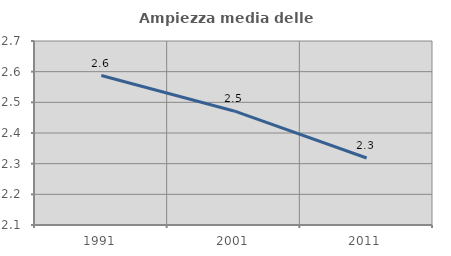
| Category | Ampiezza media delle famiglie |
|---|---|
| 1991.0 | 2.587 |
| 2001.0 | 2.472 |
| 2011.0 | 2.318 |